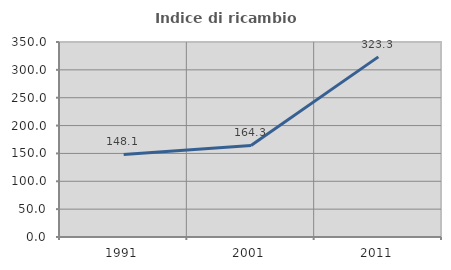
| Category | Indice di ricambio occupazionale  |
|---|---|
| 1991.0 | 148.11 |
| 2001.0 | 164.313 |
| 2011.0 | 323.276 |